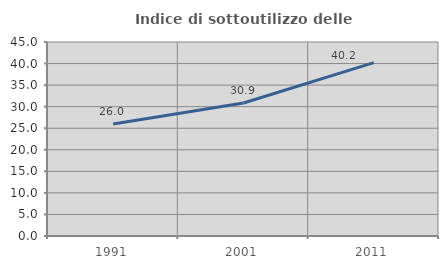
| Category | Indice di sottoutilizzo delle abitazioni  |
|---|---|
| 1991.0 | 25.958 |
| 2001.0 | 30.856 |
| 2011.0 | 40.207 |